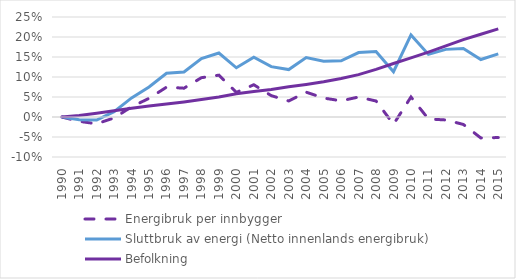
| Category | Energibruk per innbygger | Sluttbruk av energi (Netto innenlands energibruk) | Befolkning |
|---|---|---|---|
| 1990.0 | 0 | 0 | 0 |
| 1991.0 | -0.011 | -0.007 | 0.004 |
| 1992.0 | -0.017 | -0.008 | 0.01 |
| 1993.0 | -0.002 | 0.013 | 0.016 |
| 1994.0 | 0.026 | 0.048 | 0.022 |
| 1995.0 | 0.047 | 0.075 | 0.027 |
| 1996.0 | 0.075 | 0.109 | 0.032 |
| 1997.0 | 0.072 | 0.112 | 0.038 |
| 1998.0 | 0.098 | 0.146 | 0.044 |
| 1999.0 | 0.105 | 0.16 | 0.05 |
| 2000.0 | 0.062 | 0.123 | 0.058 |
| 2001.0 | 0.081 | 0.15 | 0.064 |
| 2002.0 | 0.053 | 0.126 | 0.069 |
| 2003.0 | 0.04 | 0.119 | 0.075 |
| 2004.0 | 0.062 | 0.148 | 0.081 |
| 2005.0 | 0.047 | 0.14 | 0.088 |
| 2006.0 | 0.04 | 0.141 | 0.096 |
| 2007.0 | 0.05 | 0.161 | 0.106 |
| 2008.0 | 0.04 | 0.164 | 0.119 |
| 2009.0 | -0.018 | 0.113 | 0.134 |
| 2010.0 | 0.05 | 0.205 | 0.148 |
| 2011.0 | -0.005 | 0.157 | 0.162 |
| 2012.0 | -0.007 | 0.169 | 0.178 |
| 2013.0 | -0.019 | 0.171 | 0.193 |
| 2014.0 | -0.052 | 0.144 | 0.207 |
| 2015.0 | -0.051 | 0.158 | 0.22 |